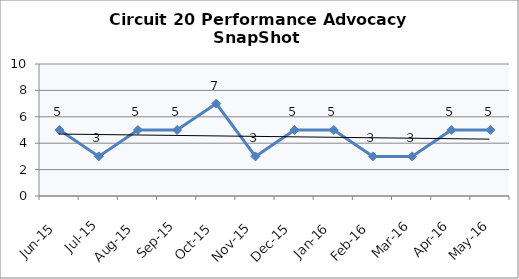
| Category | Circuit 20 |
|---|---|
| Jun-15 | 5 |
| Jul-15 | 3 |
| Aug-15 | 5 |
| Sep-15 | 5 |
| Oct-15 | 7 |
| Nov-15 | 3 |
| Dec-15 | 5 |
| Jan-16 | 5 |
| Feb-16 | 3 |
| Mar-16 | 3 |
| Apr-16 | 5 |
| May-16 | 5 |